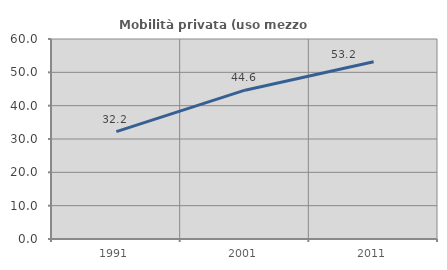
| Category | Mobilità privata (uso mezzo privato) |
|---|---|
| 1991.0 | 32.2 |
| 2001.0 | 44.643 |
| 2011.0 | 53.173 |